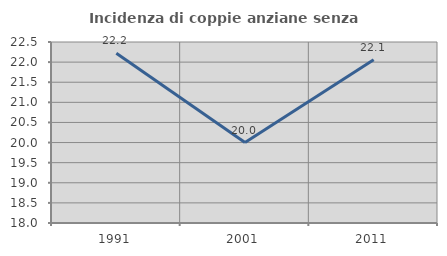
| Category | Incidenza di coppie anziane senza figli  |
|---|---|
| 1991.0 | 22.222 |
| 2001.0 | 20 |
| 2011.0 | 22.059 |